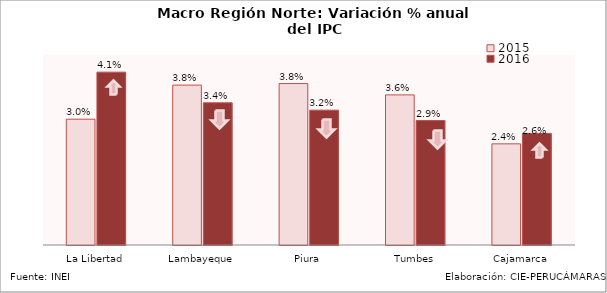
| Category | 2015 | 2016 |
|---|---|---|
| La Libertad | 0.03 | 0.041 |
| Lambayeque | 0.038 | 0.034 |
| Piura | 0.038 | 0.032 |
| Tumbes | 0.036 | 0.029 |
| Cajamarca | 0.024 | 0.026 |